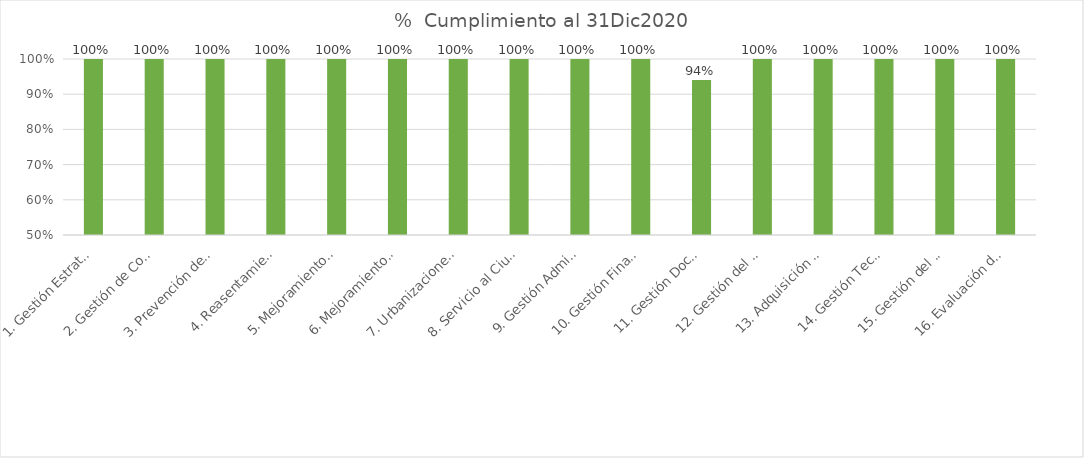
| Category | Total |
|---|---|
| 1. Gestión Estratégica | 1 |
| 2. Gestión de Comunicaciones | 1 |
| 3. Prevención del Daño Antijurídico y Representación Judicial | 1 |
| 4. Reasentamientos Humanos | 1 |
| 5. Mejoramiento de Vivienda | 1 |
| 6. Mejoramiento de Barrios  | 1 |
| 7. Urbanizaciones y Titulación | 1 |
| 8. Servicio al Ciudadano | 1 |
| 9. Gestión Administrativa | 1 |
| 10. Gestión Financiera | 1 |
| 11. Gestión Documental | 0.94 |
| 12. Gestión del Talento Humano | 1 |
| 13. Adquisición de Bienes y Servicios | 1 |
| 14. Gestión Tecnología de la Información y Comunicaciones | 1 |
| 15. Gestión del Control Interno Disciplinario | 1 |
| 16. Evaluación de la Gestión | 1 |